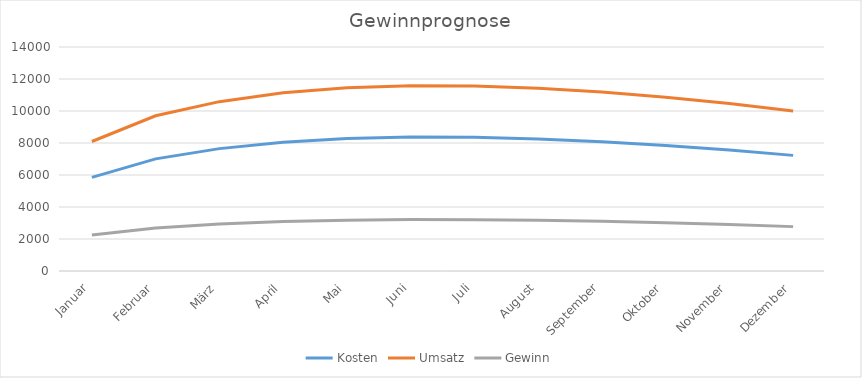
| Category | Kosten | Umsatz | Gewinn |
|---|---|---|---|
| Januar | 5848.64 | 8093.27 | 2244.63 |
| Februar | 7009.877 | 9700.174 | 2690.297 |
| März | 7648.893 | 10584.436 | 2935.543 |
| April | 8051.534 | 11141.605 | 3090.071 |
| Mai | 8277.036 | 11453.652 | 3176.615 |
| Juni | 8367.403 | 11578.7 | 3211.297 |
| Juli | 8352.245 | 11557.724 | 3205.479 |
| August | 8252.248 | 11419.35 | 3167.102 |
| September | 8081.667 | 11183.303 | 3101.635 |
| Oktober | 7850.109 | 10862.876 | 3012.766 |
| November | 7563.809 | 10466.698 | 2902.888 |
| Dezember | 7226.549 | 10000.001 | 2773.452 |